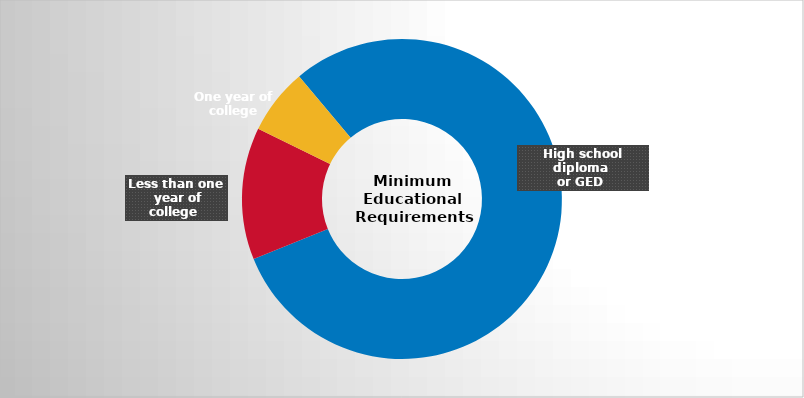
| Category | Series 0 |
|---|---|
| High school diploma/GED | 12 |
| Less than one year of college | 2 |
| One year of college | 1 |